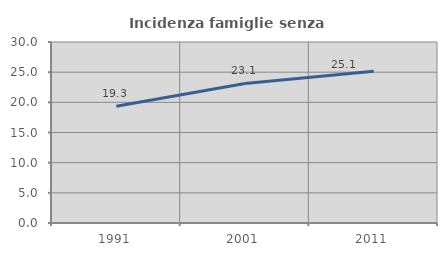
| Category | Incidenza famiglie senza nuclei |
|---|---|
| 1991.0 | 19.349 |
| 2001.0 | 23.138 |
| 2011.0 | 25.133 |